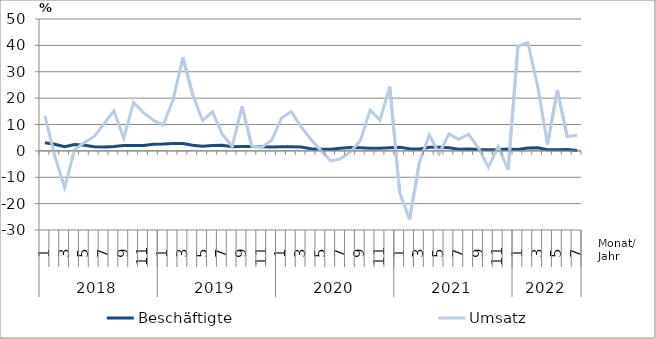
| Category | Beschäftigte | Umsatz |
|---|---|---|
| 0 | 3.1 | 13.3 |
| 1 | 2.5 | -2 |
| 2 | 1.6 | -13.9 |
| 3 | 2.4 | 0.4 |
| 4 | 2.1 | 3.2 |
| 5 | 1.6 | 5.4 |
| 6 | 1.5 | 10.3 |
| 7 | 1.7 | 15.2 |
| 8 | 2 | 4.7 |
| 9 | 2 | 18.4 |
| 10 | 2 | 14.5 |
| 11 | 2.5 | 11.6 |
| 12 | 2.6 | 9.8 |
| 13 | 2.8 | 19.4 |
| 14 | 2.8 | 35.4 |
| 15 | 2.1 | 21.3 |
| 16 | 1.8 | 11.5 |
| 17 | 2 | 14.8 |
| 18 | 2.1 | 6.3 |
| 19 | 1.6 | 1.7 |
| 20 | 1.7 | 16.9 |
| 21 | 1.7 | 1.8 |
| 22 | 1.6 | 1.4 |
| 23 | 1.5 | 4 |
| 24 | 1.6 | 12.4 |
| 25 | 1.6 | 14.9 |
| 26 | 1.5 | 9.1 |
| 27 | 0.8 | 4.3 |
| 28 | 0.6 | 0.1 |
| 29 | 0.6 | -3.8 |
| 30 | 1 | -3 |
| 31 | 1.3 | -0.4 |
| 32 | 1.2 | 3.8 |
| 33 | 1 | 15.5 |
| 34 | 1 | 11.7 |
| 35 | 1.2 | 24.4 |
| 36 | 1.4 | -15.8 |
| 37 | 0.8 | -26 |
| 38 | 0.7 | -4.3 |
| 39 | 1.4 | 6 |
| 40 | 1.4 | -1.1 |
| 41 | 1.2 | 6.4 |
| 42 | 0.6 | 4.4 |
| 43 | 0.7 | 6.3 |
| 44 | 0.5 | 1 |
| 45 | 0.4 | -6.2 |
| 46 | 0.5 | 1.6 |
| 47 | 0.7 | -7.1 |
| 48 | 0.5 | 39.7 |
| 49 | 1.1 | 41 |
| 50 | 1.2 | 24.6 |
| 51 | 0.4 | 2.4 |
| 52 | 0.4 | 23.1 |
| 53 | 0.5 | 5.4 |
| 54 | 0.1 | 5.9 |